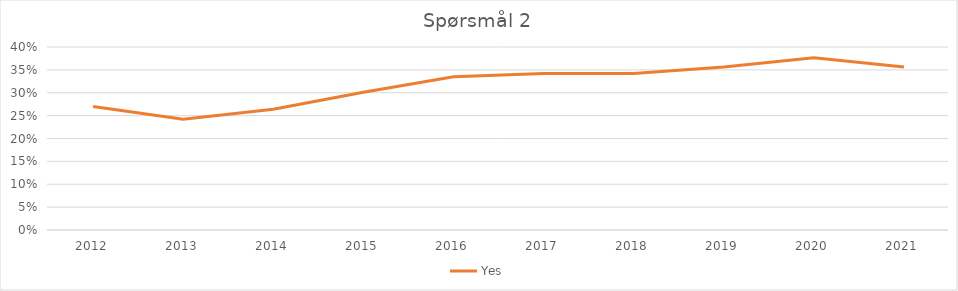
| Category | Yes |
|---|---|
| 2012.0 | 0.27 |
| 2013.0 | 0.242 |
| 2014.0 | 0.264 |
| 2015.0 | 0.301 |
| 2016.0 | 0.335 |
| 2017.0 | 0.342 |
| 2018.0 | 0.342 |
| 2019.0 | 0.356 |
| 2020.0 | 0.377 |
| 2021.0 | 0.356 |